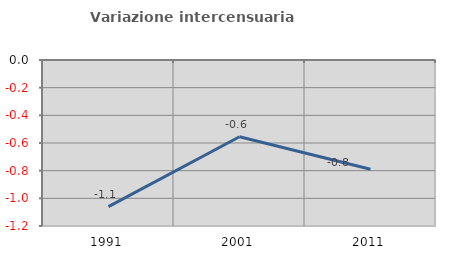
| Category | Variazione intercensuaria annua |
|---|---|
| 1991.0 | -1.06 |
| 2001.0 | -0.554 |
| 2011.0 | -0.79 |